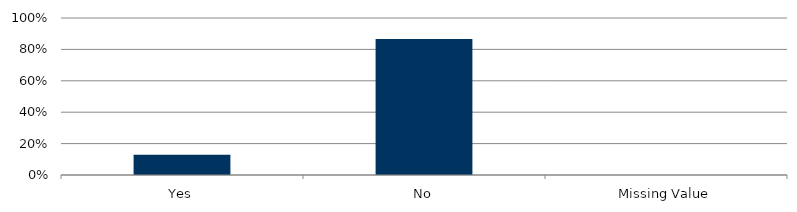
| Category | Total |
|---|---|
| Yes | 0.13 |
| No | 0.866 |
| Missing Value | 0 |